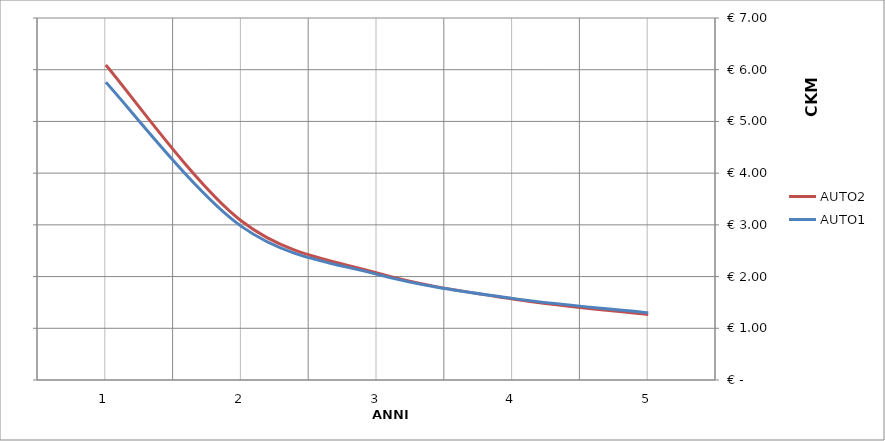
| Category | AUTO2 |
|---|---|
| 0 | 6.091 |
| 1 | 3.075 |
| 2 | 2.07 |
| 3 | 1.567 |
| 4 | 1.265 |